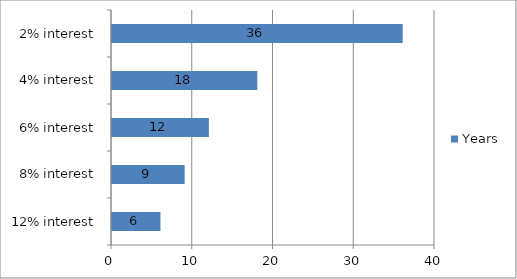
| Category | Years |
|---|---|
| 12% interest | 6 |
| 8% interest | 9 |
| 6% interest | 12 |
| 4% interest | 18 |
| 2% interest | 36 |